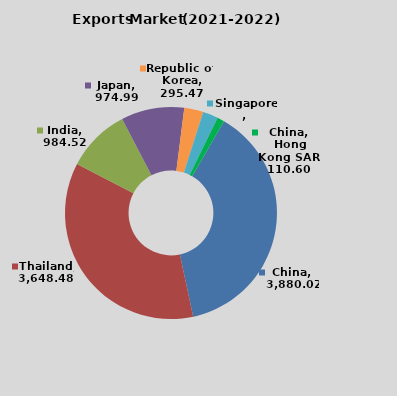
| Category | Series 0 |
|---|---|
| China | 3880.02 |
| Thailand | 3648.48 |
| India | 984.52 |
| Japan | 974.99 |
| Republic of  Korea | 295.47 |
| Singapore | 234.7 |
| China, Hong Kong SAR | 110.6 |